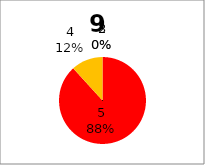
| Category | Series 0 |
|---|---|
| 5.0 | 15 |
| 4.0 | 2 |
| 3.0 | 0 |
| 2.0 | 0 |